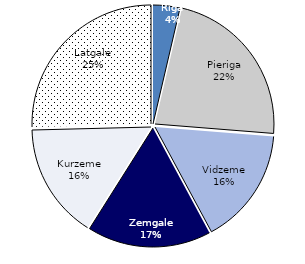
| Category | home region |
|---|---|
| Riga | 326 |
| Pieriga | 2023 |
| Vidzeme | 1419 |
| Zemgale | 1504 |
| Kurzeme | 1399 |
| Latgale | 2272 |